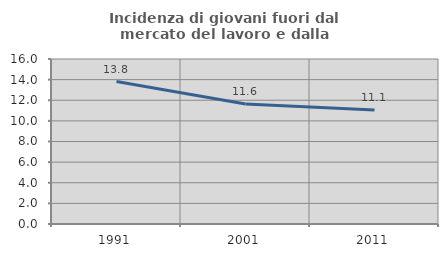
| Category | Incidenza di giovani fuori dal mercato del lavoro e dalla formazione  |
|---|---|
| 1991.0 | 13.81 |
| 2001.0 | 11.633 |
| 2011.0 | 11.053 |